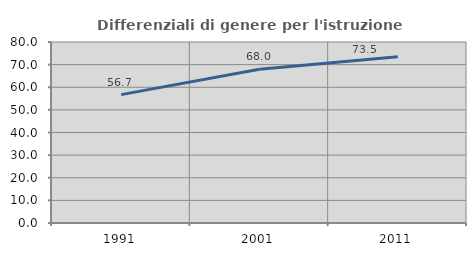
| Category | Differenziali di genere per l'istruzione superiore |
|---|---|
| 1991.0 | 56.731 |
| 2001.0 | 67.966 |
| 2011.0 | 73.487 |